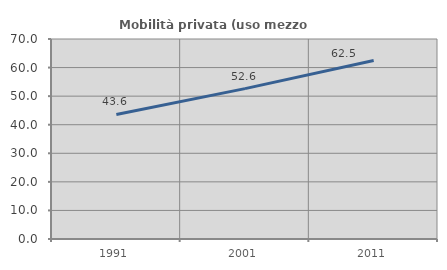
| Category | Mobilità privata (uso mezzo privato) |
|---|---|
| 1991.0 | 43.587 |
| 2001.0 | 52.627 |
| 2011.0 | 62.5 |